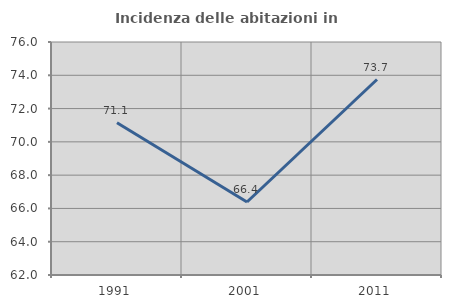
| Category | Incidenza delle abitazioni in proprietà  |
|---|---|
| 1991.0 | 71.144 |
| 2001.0 | 66.387 |
| 2011.0 | 73.745 |